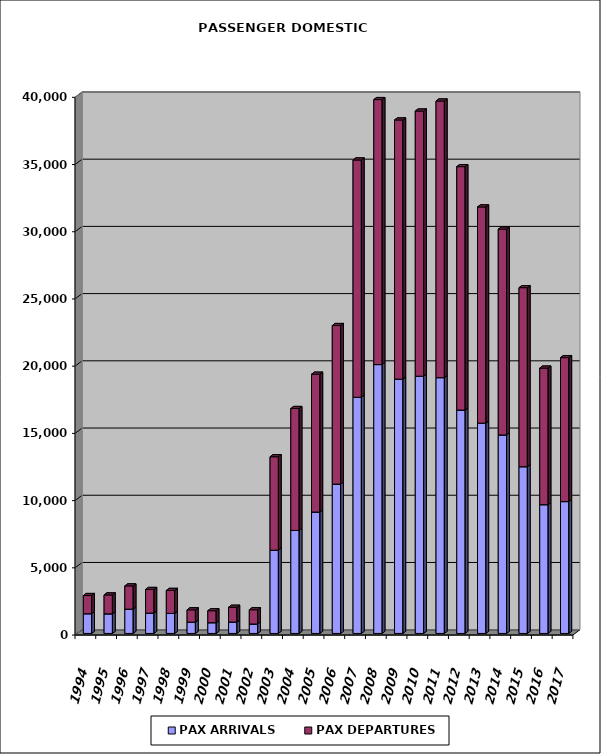
| Category | PAX ARRIVALS | PAX DEPARTURES |
|---|---|---|
| 1994.0 | 1467 | 1352 |
| 1995.0 | 1459 | 1405 |
| 1996.0 | 1807 | 1728 |
| 1997.0 | 1512 | 1758 |
| 1998.0 | 1489 | 1711 |
| 1999.0 | 839 | 918 |
| 2000.0 | 799 | 891 |
| 2001.0 | 847 | 1098 |
| 2002.0 | 702 | 1060 |
| 2003.0 | 6194 | 6950 |
| 2004.0 | 7662 | 9069 |
| 2005.0 | 9032 | 10251 |
| 2006.0 | 11109 | 11793 |
| 2007.0 | 17566 | 17652 |
| 2008.0 | 20000 | 19711 |
| 2009.0 | 18916 | 19279 |
| 2010.0 | 19136 | 19723 |
| 2011.0 | 19029 | 20575 |
| 2012.0 | 16617 | 18107 |
| 2013.0 | 15644 | 16080 |
| 2014.0 | 14767 | 15306 |
| 2015.0 | 12404 | 13316 |
| 2016.0 | 9578 | 10159 |
| 2017.0 | 9808 | 10708 |